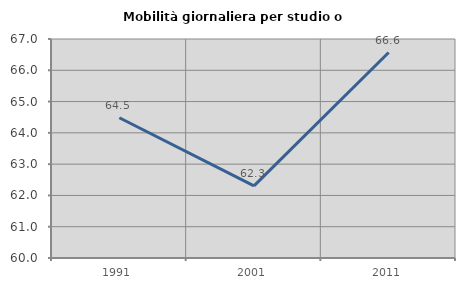
| Category | Mobilità giornaliera per studio o lavoro |
|---|---|
| 1991.0 | 64.483 |
| 2001.0 | 62.305 |
| 2011.0 | 66.567 |